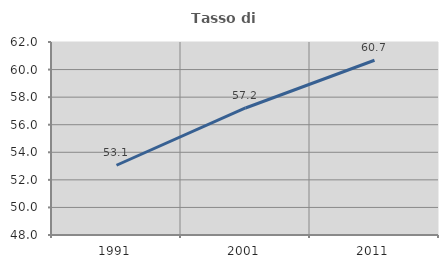
| Category | Tasso di occupazione   |
|---|---|
| 1991.0 | 53.06 |
| 2001.0 | 57.215 |
| 2011.0 | 60.674 |